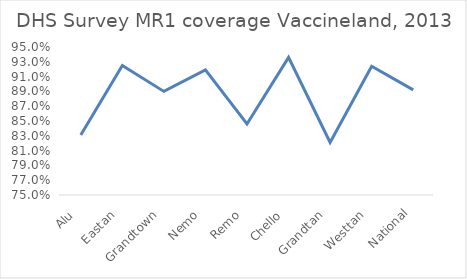
| Category | Series 0 |
|---|---|
| Alu | 0.831 |
| Eastan | 0.925 |
| Grandtown | 0.89 |
| Nemo | 0.919 |
| Remo | 0.846 |
| Chello | 0.936 |
| Grandtan | 0.821 |
| Westtan | 0.924 |
| National | 0.892 |